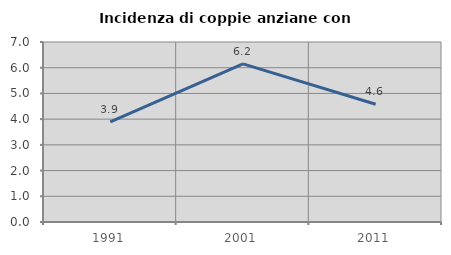
| Category | Incidenza di coppie anziane con figli |
|---|---|
| 1991.0 | 3.896 |
| 2001.0 | 6.151 |
| 2011.0 | 4.579 |